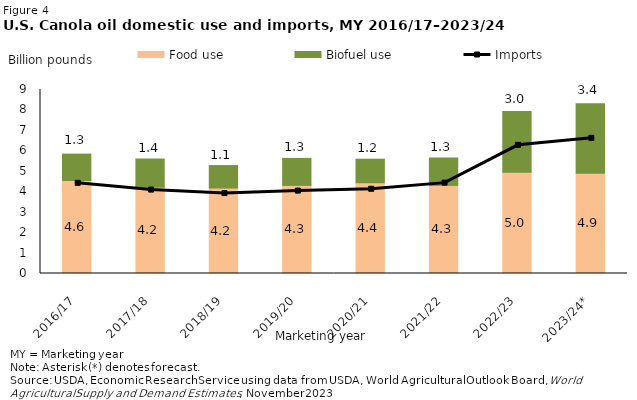
| Category | Food use | Biofuel use |
|---|---|---|
| 2016/17 | 4.55 | 1.29 |
| 2017/18 | 4.22 | 1.38 |
| 2018/19 | 4.18 | 1.1 |
| 2019/20 | 4.31 | 1.32 |
| 2020/21 | 4.44 | 1.15 |
| 2021/22 | 4.31 | 1.34 |
| 2022/23 | 4.95 | 2.97 |
| 2023/24* | 4.9 | 3.4 |